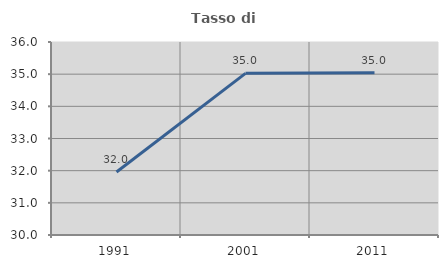
| Category | Tasso di occupazione   |
|---|---|
| 1991.0 | 31.961 |
| 2001.0 | 35.025 |
| 2011.0 | 35.043 |